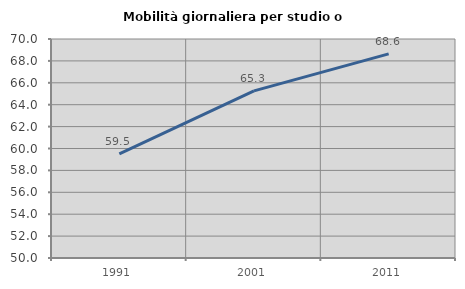
| Category | Mobilità giornaliera per studio o lavoro |
|---|---|
| 1991.0 | 59.508 |
| 2001.0 | 65.266 |
| 2011.0 | 68.639 |